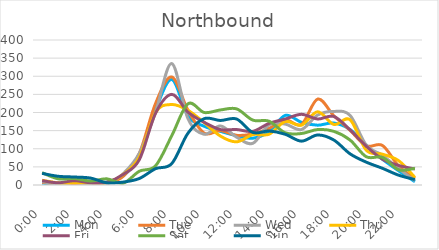
| Category | Mon | Tue | Wed | Thu | Fri | Sat | Sun |
|---|---|---|---|---|---|---|---|
| 0.0 | 5 | 7 | 9 | 13 | 12 | 34 | 32 |
| 0.041667 | 2 | 3 | 3 | 6 | 6 | 17 | 24 |
| 0.083333 | 7 | 3 | 7 | 6 | 12 | 18 | 22 |
| 0.125 | 3 | 5 | 1 | 6 | 6 | 11 | 19 |
| 0.166667 | 8 | 5 | 3 | 7 | 8 | 17 | 6 |
| 0.208333 | 25 | 24 | 31 | 29 | 29 | 5 | 8 |
| 0.25 | 80 | 87 | 88 | 77 | 70 | 38 | 18 |
| 0.291667 | 207 | 225 | 201 | 200 | 198 | 53 | 45 |
| 0.333333 | 291 | 298 | 335 | 222 | 250 | 136 | 59 |
| 0.375 | 190 | 206 | 183 | 206 | 201 | 224 | 143 |
| 0.416667 | 162 | 143 | 140 | 172 | 173 | 200 | 183 |
| 0.458333 | 148 | 150 | 163 | 135 | 153 | 207 | 178 |
| 0.5 | 136 | 137 | 132 | 119 | 153 | 210 | 182 |
| 0.541667 | 129 | 141 | 115 | 139 | 148 | 179 | 145 |
| 0.5833333333333334 | 147 | 156 | 166 | 140 | 170 | 176 | 149 |
| 0.625 | 192 | 180 | 168 | 175 | 182 | 144 | 140 |
| 0.666667 | 173 | 167 | 153 | 165 | 195 | 142 | 121 |
| 0.708333 | 165 | 237 | 193 | 202 | 182 | 153 | 138 |
| 0.75 | 171 | 191 | 203 | 167 | 189 | 148 | 124 |
| 0.791667 | 153 | 151 | 192 | 180 | 152 | 124 | 86 |
| 0.833333 | 110 | 108 | 110 | 96 | 107 | 78 | 63 |
| 0.875 | 71 | 109 | 82 | 85 | 71 | 76 | 46 |
| 0.916667 | 39 | 52 | 45 | 67 | 54 | 42 | 27 |
| 0.958333 | 9 | 18 | 12 | 21 | 44 | 46 | 15 |